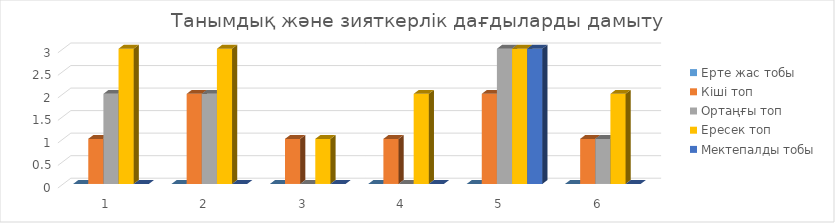
| Category | Ерте жас тобы  | Кіші топ | Ортаңғы топ | Ересек топ | Мектепалды тобы |
|---|---|---|---|---|---|
| 0 | 0 | 1 | 2 | 3 | 0 |
| 1 | 0 | 2 | 2 | 3 | 0 |
| 2 | 0 | 1 | 0 | 1 | 0 |
| 3 | 0 | 1 | 0 | 2 | 0 |
| 4 | 0 | 2 | 3 | 3 | 3 |
| 5 | 0 | 1 | 1 | 2 | 0 |